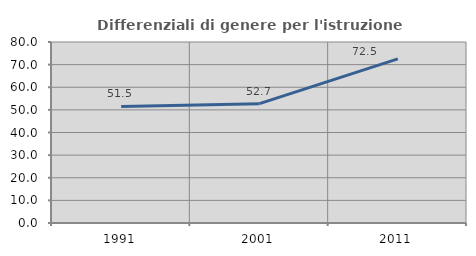
| Category | Differenziali di genere per l'istruzione superiore |
|---|---|
| 1991.0 | 51.515 |
| 2001.0 | 52.74 |
| 2011.0 | 72.527 |